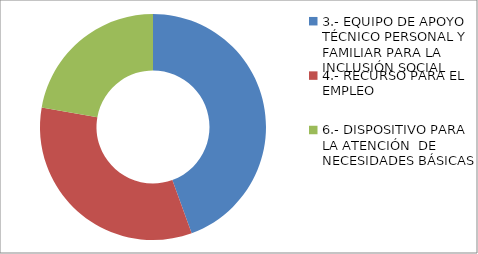
| Category | Series 0 |
|---|---|
| 3.- EQUIPO DE APOYO TÉCNICO PERSONAL Y FAMILIAR PARA LA INCLUSIÓN SOCIAL | 4 |
| 4.- RECURSO PARA EL EMPLEO | 3 |
| 6.- DISPOSITIVO PARA LA ATENCIÓN  DE NECESIDADES BÁSICAS | 2 |